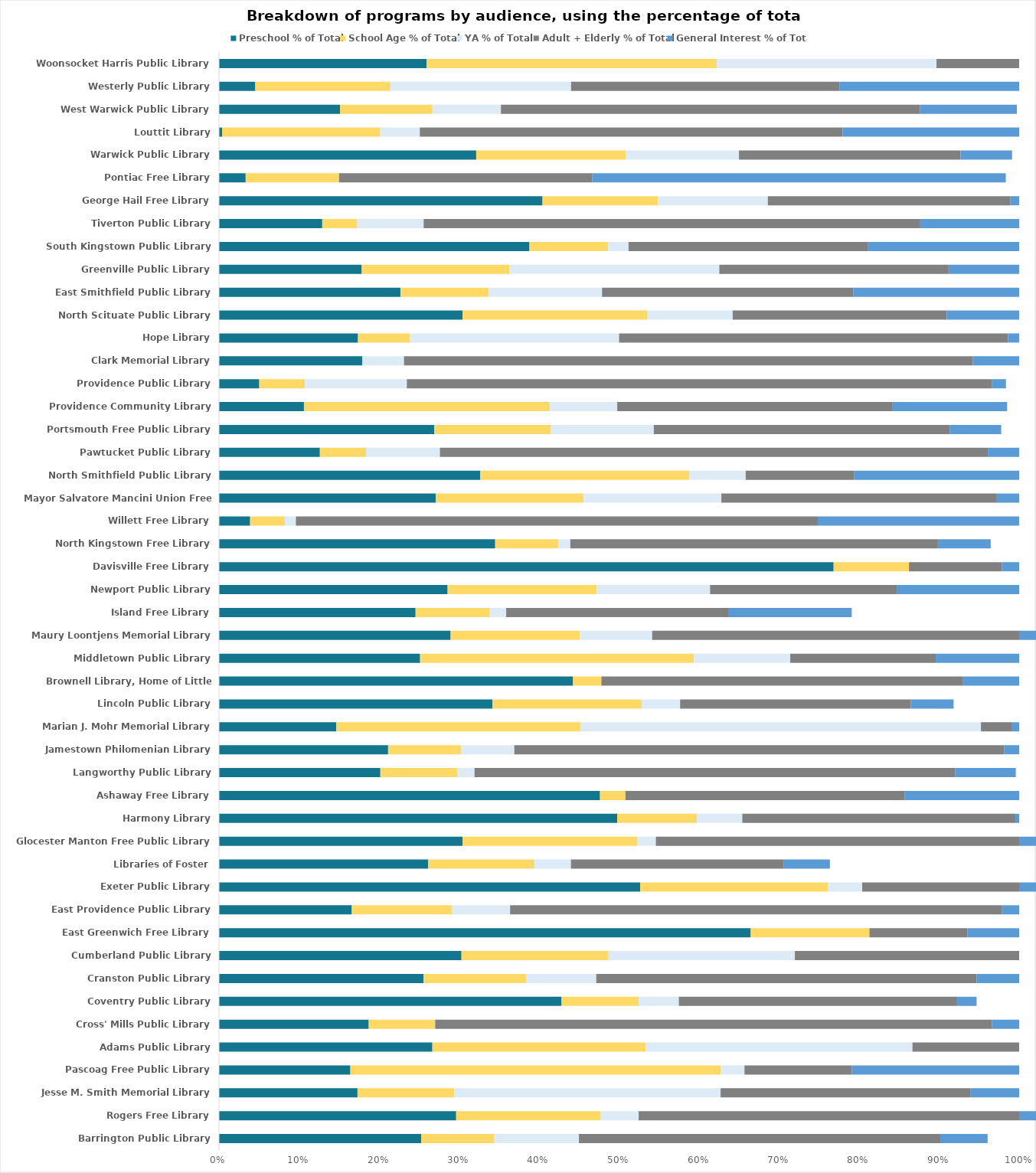
| Category | Preschool % of Total | School Age % of Total | YA % of Total | Adult + Elderly % of Total | General Interest % of Total |
|---|---|---|---|---|---|
| Barrington Public Library | 0.253 | 0.091 | 0.106 | 0.452 | 0.059 |
| Rogers Free Library | 0.296 | 0.181 | 0.047 | 0.647 | 0.078 |
| Jesse M. Smith Memorial Library | 0.173 | 0.121 | 0.333 | 0.313 | 0.084 |
| Pascoag Free Public Library | 0.164 | 0.463 | 0.03 | 0.134 | 0.209 |
| Adams Public Library | 0.267 | 0.267 | 0.333 | 1.067 | 0 |
| Cross' Mills Public Library | 0.187 | 0.083 | 0 | 0.696 | 0.034 |
| Coventry Public Library | 0.428 | 0.096 | 0.05 | 0.348 | 0.024 |
| Cranston Public Library | 0.256 | 0.128 | 0.087 | 0.475 | 0.053 |
| Cumberland Public Library | 0.303 | 0.184 | 0.233 | 0.28 | 0 |
| East Greenwich Free Library | 0.665 | 0.148 | 0 | 0.123 | 0.116 |
| East Providence Public Library | 0.166 | 0.126 | 0.072 | 0.615 | 0.098 |
| Exeter Public Library | 0.526 | 0.234 | 0.043 | 0.292 | 0.081 |
| Libraries of Foster | 0.261 | 0.133 | 0.046 | 0.266 | 0.058 |
| Glocester Manton Free Public Library | 0.305 | 0.218 | 0.023 | 0.529 | 0.006 |
| Harmony Library | 0.498 | 0.1 | 0.057 | 0.341 | 0.005 |
| Ashaway Free Library | 0.476 | 0.032 | 0 | 0.349 | 0.143 |
| Langworthy Public Library | 0.202 | 0.097 | 0.021 | 0.601 | 0.076 |
| Jamestown Philomenian Library | 0.211 | 0.091 | 0.066 | 0.612 | 0.025 |
| Marian J. Mohr Memorial Library | 0.146 | 0.306 | 0.5 | 0.038 | 0.01 |
| Lincoln Public Library | 0.342 | 0.186 | 0.048 | 0.288 | 0.054 |
| Brownell Library, Home of Little Compton | 0.442 | 0.035 | 0 | 0.451 | 0.133 |
| Middletown Public Library | 0.251 | 0.342 | 0.12 | 0.182 | 0.128 |
| Maury Loontjens Memorial Library | 0.289 | 0.162 | 0.09 | 0.707 | 0.03 |
| Island Free Library | 0.246 | 0.092 | 0.021 | 0.278 | 0.154 |
| Newport Public Library | 0.286 | 0.187 | 0.141 | 0.233 | 0.165 |
| Davisville Free Library | 0.768 | 0.094 | 0 | 0.116 | 0.022 |
| North Kingstown Free Library | 0.345 | 0.079 | 0.015 | 0.459 | 0.066 |
| Willett Free Library | 0.039 | 0.043 | 0.014 | 0.652 | 0.252 |
| Mayor Salvatore Mancini Union Free Library | 0.271 | 0.185 | 0.172 | 0.344 | 0.028 |
| North Smithfield Public Library | 0.327 | 0.261 | 0.07 | 0.136 | 0.206 |
| Pawtucket Public Library | 0.126 | 0.058 | 0.092 | 0.685 | 0.039 |
| Portsmouth Free Public Library | 0.269 | 0.146 | 0.129 | 0.37 | 0.064 |
| Providence Community Library | 0.106 | 0.307 | 0.084 | 0.344 | 0.144 |
| Providence Public Library | 0.05 | 0.057 | 0.127 | 0.731 | 0.018 |
| Clark Memorial Library | 0.179 | 0 | 0.052 | 0.711 | 0.058 |
| Hope Library | 0.174 | 0.065 | 0.261 | 0.486 | 0.02 |
| North Scituate Public Library | 0.305 | 0.23 | 0.107 | 0.267 | 0.091 |
| East Smithfield Public Library | 0.227 | 0.11 | 0.141 | 0.314 | 0.207 |
| Greenville Public Library | 0.178 | 0.184 | 0.263 | 0.287 | 0.088 |
| South Kingstown Public Library | 0.388 | 0.098 | 0.026 | 0.299 | 0.189 |
| Tiverton Public Library | 0.129 | 0.044 | 0.083 | 0.62 | 0.124 |
| George Hail Free Library | 0.404 | 0.144 | 0.137 | 0.303 | 0.04 |
| Pontiac Free Library | 0.033 | 0.117 | 0 | 0.317 | 0.517 |
| Warwick Public Library | 0.321 | 0.187 | 0.141 | 0.277 | 0.064 |
| Louttit Library | 0.004 | 0.198 | 0.049 | 0.529 | 0.243 |
| West Warwick Public Library | 0.151 | 0.116 | 0.086 | 0.524 | 0.121 |
| Westerly Public Library | 0.045 | 0.169 | 0.226 | 0.335 | 0.249 |
| Woonsocket Harris Public Library | 0.259 | 0.363 | 0.275 | 0.103 | 0 |